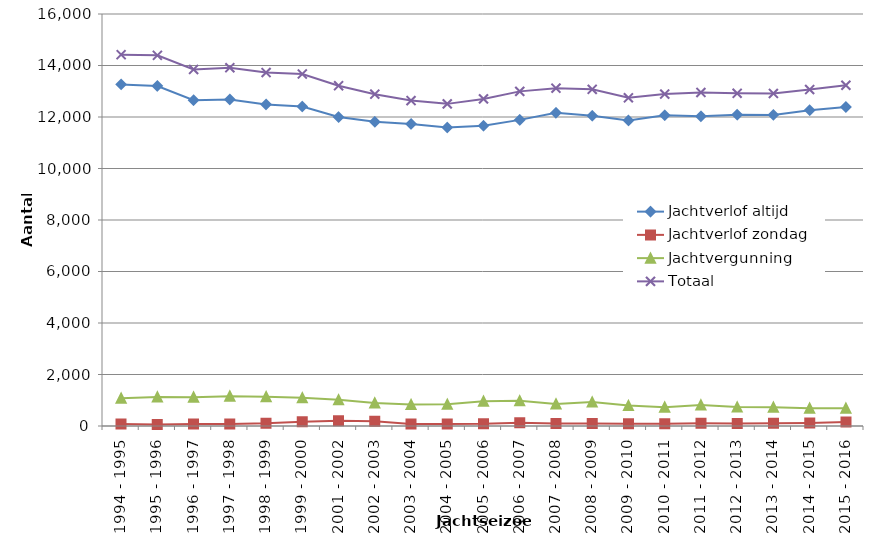
| Category | Jachtverlof altijd | Jachtverlof zondag | Jachtvergunning | Totaal |
|---|---|---|---|---|
| 1994 - 1995 | 13265 | 73 | 1082 | 14420 |
| 1995 - 1996 | 13206 | 60 | 1129 | 14395 |
| 1996 - 1997 | 12652 | 74 | 1121 | 13847 |
| 1997 - 1998 | 12682 | 75 | 1158 | 13915 |
| 1998 - 1999 | 12487 | 102 | 1137 | 13726 |
| 1999 - 2000 | 12408 | 165 | 1096 | 13669 |
| 2001 - 2002 | 11998 | 201 | 1016 | 13215 |
| 2002 - 2003 | 11812 | 181 | 894 | 12887 |
| 2003 - 2004 | 11731 | 75 | 832 | 12638 |
| 2004 - 2005 | 11590 | 79 | 841 | 12510 |
| 2005 - 2006 | 11661 | 85 | 957 | 12703 |
| 2006 - 2007 | 11888 | 131 | 976 | 12995 |
| 2007 - 2008 | 12162 | 101 | 857 | 13120 |
| 2008 - 2009 | 12048 | 95 | 930 | 13073 |
| 2009 - 2010 | 11866 | 86 | 794 | 12746 |
| 2010 - 2011 | 12068 | 91 | 731 | 12890 |
| 2011 - 2012 | 12027 | 109 | 816 | 12952 |
| 2012 - 2013 | 12088 | 99 | 734 | 12921 |
| 2013 - 2014 | 12081 | 105 | 729 | 12915 |
| 2014 - 2015 | 12263 | 116 | 687 | 13066 |
| 2015 - 2016 | 12387 | 154 | 692 | 13233 |